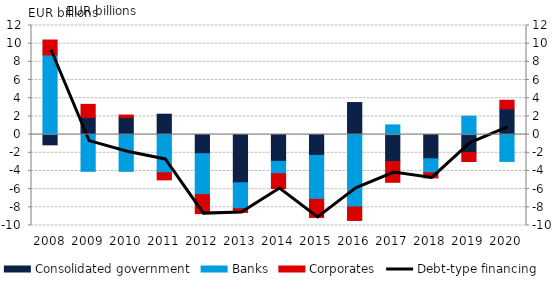
| Category | Consolidated government | Banks | Corporates |
|---|---|---|---|
| 2008.0 | -1.125 | 8.757 | 1.647 |
| 2009.0 | 1.882 | -4.038 | 1.444 |
| 2010.0 | 1.875 | -4.043 | 0.274 |
| 2011.0 | 2.243 | -4.2 | -0.78 |
| 2012.0 | -2.104 | -4.501 | -2.087 |
| 2013.0 | -5.3 | -2.846 | -0.416 |
| 2014.0 | -2.942 | -1.37 | -1.625 |
| 2015.0 | -2.287 | -4.833 | -1.993 |
| 2016.0 | 3.526 | -7.961 | -1.485 |
| 2017.0 | -2.959 | 1.067 | -2.287 |
| 2018.0 | -2.66 | -1.537 | -0.566 |
| 2019.0 | -1.97 | 2.023 | -0.99 |
| 2020.0 | 2.822 | -2.95 | 0.953 |